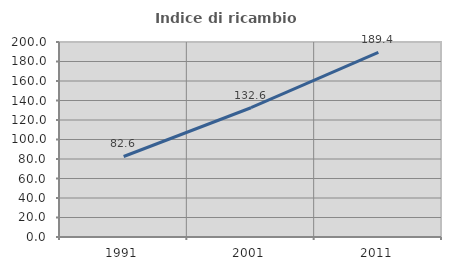
| Category | Indice di ricambio occupazionale  |
|---|---|
| 1991.0 | 82.569 |
| 2001.0 | 132.584 |
| 2011.0 | 189.441 |